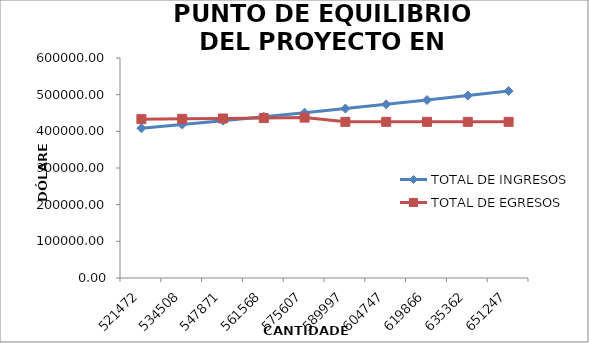
| Category | TOTAL DE INGRESOS | TOTAL DE EGRESOS |
|---|---|---|
| 521471.55637228984 | 408379.166 | 433196.132 |
| 534508.3452815971 | 418588.645 | 434076.029 |
| 547871.0539136367 | 429053.361 | 435061.513 |
| 561567.8302614779 | 439779.695 | 436165.256 |
| 575607.0260180146 | 450774.188 | 437401.448 |
| 589997.201668465 | 462043.543 | 425863.657 |
| 604747.1317101766 | 473594.631 | 425863.657 |
| 619865.810002931 | 485434.497 | 425863.657 |
| 635362.4552530042 | 497570.359 | 425863.657 |
| 651246.5166343293 | 510009.618 | 425863.657 |